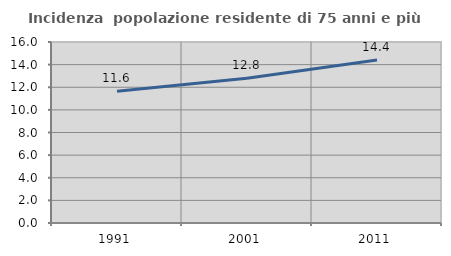
| Category | Incidenza  popolazione residente di 75 anni e più |
|---|---|
| 1991.0 | 11.639 |
| 2001.0 | 12.787 |
| 2011.0 | 14.404 |